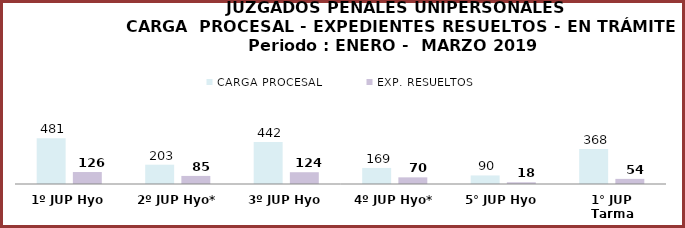
| Category | CARGA PROCESAL | EXP. RESUELTOS |
|---|---|---|
| 1º JUP Hyo | 481 | 126 |
| 2º JUP Hyo* | 203 | 85 |
| 3º JUP Hyo | 442 | 124 |
| 4º JUP Hyo* | 169 | 70 |
| 5° JUP Hyo | 90 | 18 |
| 1° JUP Tarma | 368 | 54 |